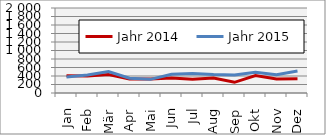
| Category | Jahr 2014 | Jahr 2015 |
|---|---|---|
| Jan | 406.307 | 377.836 |
| Feb | 397.213 | 423.743 |
| Mär | 433.685 | 505.901 |
| Apr | 326.835 | 347.947 |
| Mai | 327.526 | 320.822 |
| Jun | 351.454 | 440.62 |
| Jul | 321.761 | 461.181 |
| Aug | 351.994 | 435.289 |
| Sep | 251.505 | 425.741 |
| Okt | 410.925 | 489.91 |
| Nov | 328.449 | 432.079 |
| Dez | 333.376 | 517.379 |